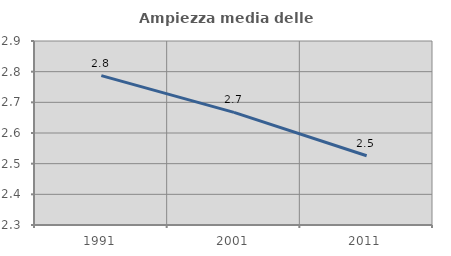
| Category | Ampiezza media delle famiglie |
|---|---|
| 1991.0 | 2.787 |
| 2001.0 | 2.667 |
| 2011.0 | 2.526 |